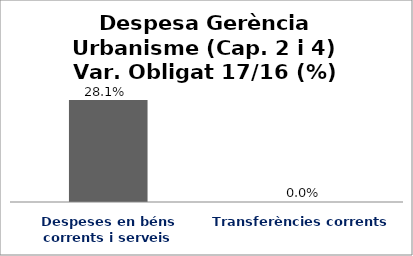
| Category | Series 0 |
|---|---|
| Despeses en béns corrents i serveis | 0.281 |
| Transferències corrents | 0 |